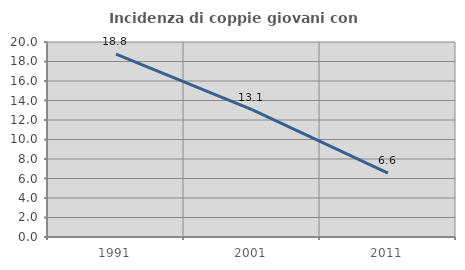
| Category | Incidenza di coppie giovani con figli |
|---|---|
| 1991.0 | 18.76 |
| 2001.0 | 13.057 |
| 2011.0 | 6.555 |